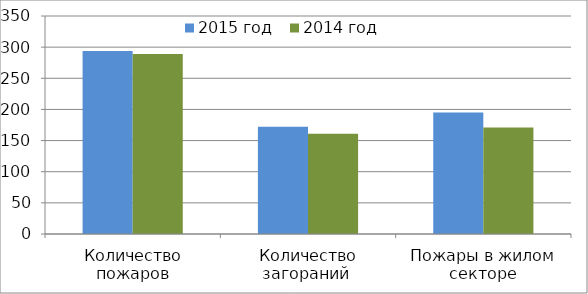
| Category | 2015 год | 2014 год |
|---|---|---|
| Количество пожаров | 294 | 289 |
| Количество загораний  | 172 | 161 |
| Пожары в жилом секторе | 195 | 171 |